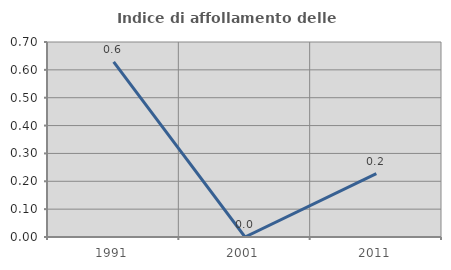
| Category | Indice di affollamento delle abitazioni  |
|---|---|
| 1991.0 | 0.629 |
| 2001.0 | 0 |
| 2011.0 | 0.227 |